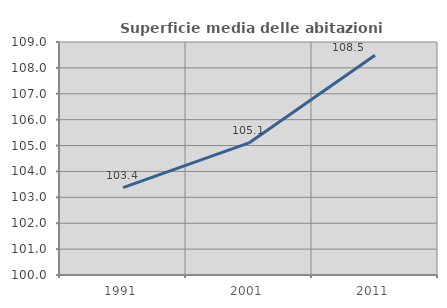
| Category | Superficie media delle abitazioni occupate |
|---|---|
| 1991.0 | 103.374 |
| 2001.0 | 105.102 |
| 2011.0 | 108.489 |